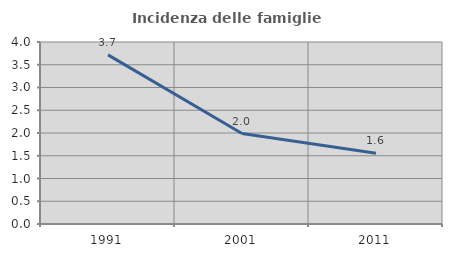
| Category | Incidenza delle famiglie numerose |
|---|---|
| 1991.0 | 3.716 |
| 2001.0 | 1.989 |
| 2011.0 | 1.556 |